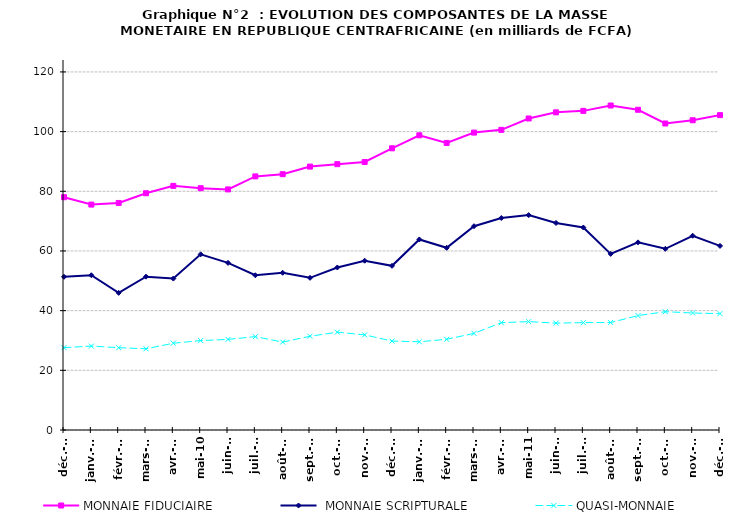
| Category | MONNAIE FIDUCIAIRE |  MONNAIE SCRIPTURALE | QUASI-MONNAIE |
|---|---|---|---|
| 2009-12-04 | 78017 | 51345 | 27605 |
| 2010-01-04 | 75550 | 51858 | 28121 |
| 2010-02-04 | 76087 | 45961 | 27585 |
| 2010-03-04 | 79339 | 51387 | 27215 |
| 2010-04-04 | 81817 | 50750 | 29086 |
| 2010-05-04 | 81036 | 58869 | 29964 |
| 2010-06-04 | 80631 | 56013 | 30371 |
| 2010-07-04 | 84991 | 51852 | 31292 |
| 2010-08-04 | 85728 | 52699 | 29467 |
| 2010-09-04 | 88273 | 51000 | 31415 |
| 2010-10-04 | 89097 | 54467 | 32786 |
| 2010-11-04 | 89815 | 56736 | 31880 |
| 2010-12-04 | 94408 | 55018 | 29806 |
| 2011-01-01 | 98767 | 63857 | 29562 |
| 2011-02-01 | 96215 | 61053 | 30405 |
| 2011-03-01 | 99668 | 68290 | 32390 |
| 2011-04-01 | 100591 | 71040 | 35964 |
| 2011-05-01 | 104400 | 72019 | 36331 |
| 2011-06-01 | 106453 | 69373 | 35811 |
| 2011-07-01 | 106952 | 67875 | 35982 |
| 2011-08-01 | 108746 | 59019 | 36031 |
| 2011-09-01 | 107318 | 62882 | 38340 |
| 2011-10-01 | 102721 | 60722 | 39649 |
| 2011-11-01 | 103806 | 65103 | 39212 |
| 2011-12-01 | 105523 | 61691 | 39005 |